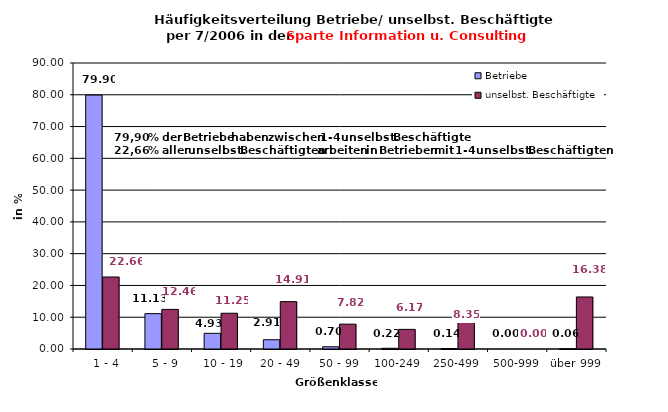
| Category | Betriebe | unselbst. Beschäftigte |
|---|---|---|
|   1 - 4 | 79.905 | 22.661 |
|   5 - 9 | 11.127 | 12.464 |
|  10 - 19 | 4.933 | 11.246 |
| 20 - 49 | 2.915 | 14.909 |
| 50 - 99 | 0.701 | 7.82 |
| 100-249 | 0.224 | 6.174 |
| 250-499 | 0.14 | 8.349 |
| 500-999 | 0 | 0 |
| über 999 | 0.056 | 16.376 |